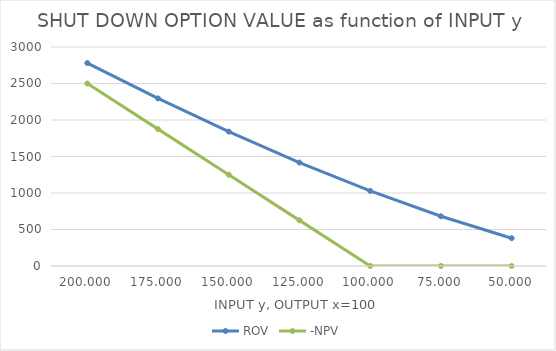
| Category | ROV | -NPV |
|---|---|---|
| 200.0 | 2780.175 | 2500 |
| 175.0 | 2295.693 | 1875 |
| 150.0 | 1840.411 | 1250 |
| 125.0 | 1417.006 | 625 |
| 100.0 | 1028.979 | 0 |
| 75.0 | 681.16 | 0 |
| 50.0 | 380.838 | 0 |